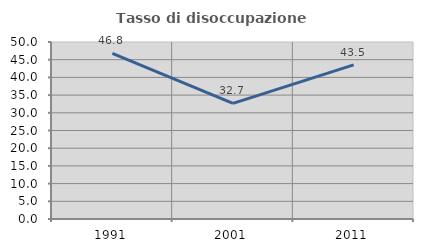
| Category | Tasso di disoccupazione giovanile  |
|---|---|
| 1991.0 | 46.795 |
| 2001.0 | 32.673 |
| 2011.0 | 43.529 |